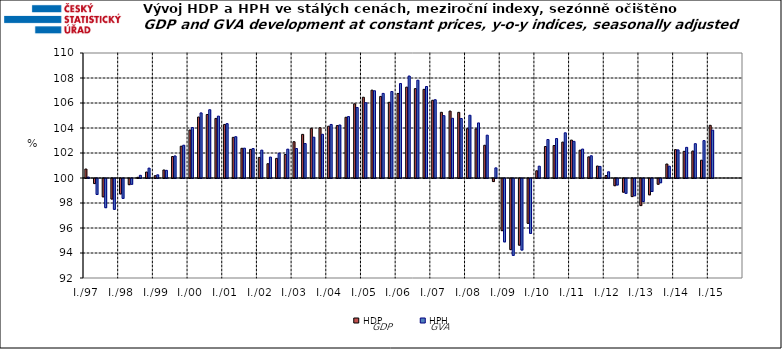
| Category | HDP

 | HPH

 |
|---|---|---|
| I./97 | 100.719 | 100.078 |
|  | 99.595 | 98.722 |
|  | 98.534 | 97.665 |
|  | 98.357 | 97.533 |
| I./98 | 98.767 | 98.409 |
|  | 99.507 | 99.536 |
|  | 100.056 | 100.215 |
|  | 100.477 | 100.79 |
| I./99 | 100.184 | 100.255 |
|  | 100.641 | 100.613 |
|  | 101.719 | 101.764 |
|  | 102.543 | 102.623 |
| I./00 | 103.839 | 104.038 |
|  | 104.879 | 105.209 |
|  | 105.081 | 105.463 |
|  | 104.766 | 104.949 |
| I./01 | 104.286 | 104.349 |
|  | 103.251 | 103.304 |
|  | 102.376 | 102.387 |
|  | 102.289 | 102.357 |
| I./02 | 101.649 | 102.23 |
|  | 101.143 | 101.673 |
|  | 101.57 | 101.981 |
|  | 101.879 | 102.308 |
| I./03 | 102.903 | 102.359 |
|  | 103.49 | 102.756 |
|  | 103.973 | 103.265 |
|  | 104.02 | 103.498 |
| I./04 | 104.144 | 104.283 |
|  | 104.194 | 104.242 |
|  | 104.858 | 104.915 |
|  | 105.936 | 105.641 |
| I./05 | 106.461 | 106.023 |
|  | 107.028 | 106.978 |
|  | 106.527 | 106.768 |
|  | 106.058 | 106.921 |
| I./06 | 106.765 | 107.557 |
|  | 107.271 | 108.159 |
|  | 107.149 | 107.824 |
|  | 107.092 | 107.32 |
| I./07 | 106.219 | 106.262 |
|  | 105.256 | 104.989 |
|  | 105.353 | 104.776 |
|  | 105.253 | 104.762 |
| I./08 | 103.944 | 105.02 |
|  | 103.926 | 104.405 |
|  | 102.618 | 103.426 |
|  | 99.755 | 100.81 |
| I./09 | 95.828 | 94.929 |
|  | 94.31 | 93.851 |
|  | 94.667 | 94.276 |
|  | 96.414 | 95.606 |
| I./10 | 100.577 | 100.947 |
|  | 102.519 | 103.079 |
|  | 102.598 | 103.157 |
|  | 102.874 | 103.616 |
| I./11 | 103.033 | 102.931 |
|  | 102.227 | 102.316 |
|  | 101.692 | 101.781 |
|  | 100.959 | 100.93 |
| I./12 | 100.2 | 100.496 |
|  | 99.425 | 99.48 |
|  | 98.904 | 98.813 |
|  | 98.554 | 98.618 |
| I./13 | 97.833 | 98.157 |
|  | 98.694 | 98.96 |
|  | 99.541 | 99.662 |
|  | 101.121 | 100.945 |
| I./14 | 102.27 | 102.25 |
|  | 102.132 | 102.452 |
|  | 102.16 | 102.746 |
|  | 101.423 | 102.991 |
| I./15 | 104.216 | 103.828 |